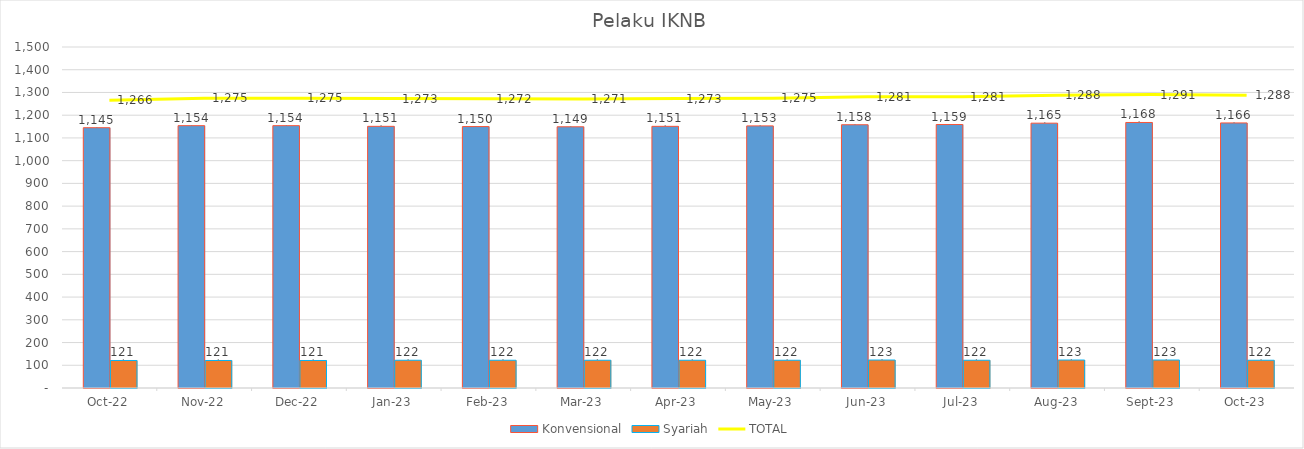
| Category |  Konvensional  |  Syariah  |
|---|---|---|
| 2022-10-01 | 1145 | 121 |
| 2022-11-01 | 1154 | 121 |
| 2022-12-01 | 1154 | 121 |
| 2023-01-01 | 1151 | 122 |
| 2023-02-01 | 1150 | 122 |
| 2023-03-01 | 1149 | 122 |
| 2023-04-01 | 1151 | 122 |
| 2023-05-01 | 1153 | 122 |
| 2023-06-01 | 1158 | 123 |
| 2023-07-01 | 1159 | 122 |
| 2023-08-01 | 1165 | 123 |
| 2023-09-01 | 1168 | 123 |
| 2023-10-31 | 1166 | 122 |